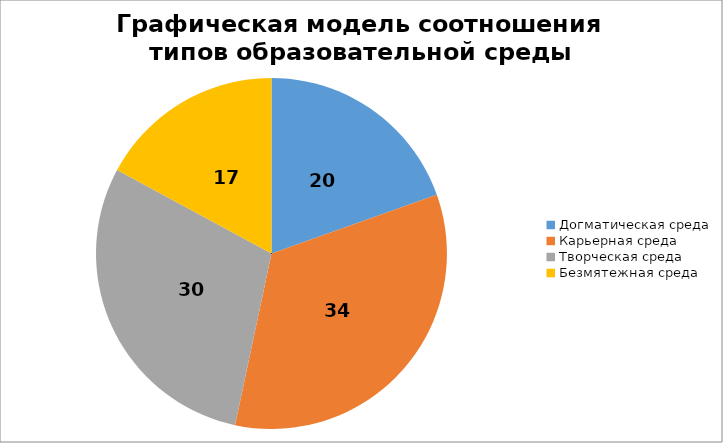
| Category | Графическая модель соотношения типов образовательной среды |
|---|---|
| Догматическая среда | 19.556 |
| Карьерная среда | 33.778 |
| Творческая среда | 29.556 |
| Безмятежная среда | 17.111 |